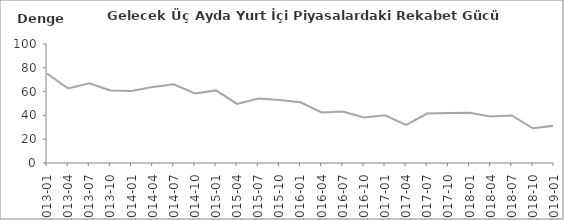
| Category | Series 2 |
|---|---|
| 2013-01 | 75.2 |
| 2013-04 | 62.6 |
| 2013-07 | 66.9 |
| 2013-10 | 61 |
| 2014-01 | 60.5 |
| 2014-04 | 63.8 |
| 2014-07 | 66.1 |
| 2014-10 | 58.4 |
| 2015-01 | 61 |
| 2015-04 | 49.7 |
| 2015-07 | 54.1 |
| 2015-10 | 52.9 |
| 2016-01 | 51 |
| 2016-04 | 42.5 |
| 2016-07 | 43.3 |
| 2016-10 | 38.2 |
| 2017-01 | 40.1 |
| 2017-04 | 32 |
| 2017-07 | 41.5 |
| 2017-10 | 42 |
| 2018-01 | 42.2 |
| 2018-04 | 39.1 |
| 2018-07 | 40 |
| 2018-10 | 29.2 |
| 2019-01 | 31.3 |